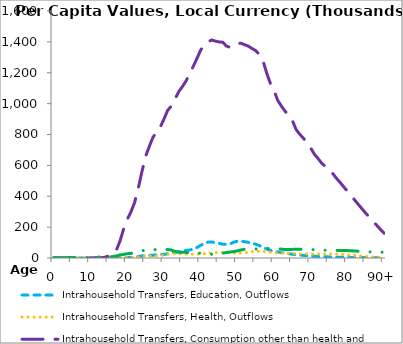
| Category | Intrahousehold Transfers, Education, Outflows | Intrahousehold Transfers, Health, Outflows | Intrahousehold Transfers, Consumption other than health and education, Outflows | Intrahousehold Transfers, Saving, Outflows |
|---|---|---|---|---|
| 0 | 0 | 0 | 13.707 | 1783.358 |
|  | 0 | 0 | 17.182 | 2243.664 |
| 2 | 0 | 0 | 13.179 | 1721.308 |
| 3 | 0.654 | 0 | 205.832 | 692.007 |
| 4 | 1.69 | 1.785 | 955.739 | 773.496 |
| 5 | 2.121 | 4.487 | 1674.86 | 2224.94 |
| 6 | 3.952 | 5.185 | 1877.273 | 3678.581 |
| 7 | 5.932 | 4.611 | 1683.966 | 4363.57 |
| 8 | 6.515 | 1.605 | 909.404 | 4203.334 |
| 9 | 7.216 | 3.31 | 617.222 | 3196.895 |
| 10 | 8.465 | 13.15 | 607.059 | 3528.599 |
| 11 | 12.484 | 26.097 | 797.229 | 4972.968 |
| 12 | 16.513 | 29.863 | 1231.877 | 7417.302 |
| 13 | 15.781 | 18.721 | 1847.221 | 7251.736 |
| 14 | 18.199 | 19.478 | 5093.768 | 5128.793 |
| 15 | 54.194 | 107.028 | 14907.415 | 6028.225 |
| 16 | 104.357 | 367.074 | 26502.081 | 8933.692 |
| 17 | 280.996 | 698.479 | 49227.429 | 13009.551 |
| 18 | 497.814 | 1469.888 | 108487.827 | 19297.418 |
| 19 | 945.268 | 2265.053 | 186185.487 | 23284.167 |
| 20 | 1926.455 | 2944.24 | 249116.11 | 27752.077 |
| 21 | 3734.16 | 3605.398 | 298258.717 | 29795.702 |
| 22 | 6635.319 | 5137.172 | 358544.565 | 36053.593 |
| 23 | 10361.619 | 7685.742 | 451713.299 | 42611.892 |
| 24 | 13195.509 | 10681.367 | 559153.868 | 46873.801 |
| 25 | 16076.113 | 13174.806 | 657746.625 | 51442.062 |
| 26 | 16872.816 | 13306.425 | 722515.627 | 50741.387 |
| 27 | 17973.904 | 13061.286 | 781390.99 | 50209.87 |
| 28 | 21116.834 | 13243.843 | 816418.22 | 56999.038 |
| 29 | 22050.311 | 15247.572 | 848299.57 | 58268.922 |
| 30 | 23417.652 | 19770.29 | 899786.01 | 55025.84 |
| 31 | 27276.328 | 23838.103 | 955683.53 | 54931.849 |
| 32 | 31847.605 | 26743.497 | 984480.37 | 51820.595 |
| 33 | 36155.291 | 29030.312 | 1028780.56 | 42890.42 |
| 34 | 40764.027 | 28572.796 | 1076789.65 | 37760.347 |
| 35 | 44831.846 | 26243.493 | 1109194.96 | 37761.679 |
| 36 | 48908.671 | 25120.842 | 1145803.18 | 36109.074 |
| 37 | 51708.419 | 24692.826 | 1195026.61 | 33805.966 |
| 38 | 57630.895 | 24752.387 | 1241829.25 | 33550.216 |
| 39 | 68425.327 | 25915.364 | 1293001.29 | 32477.774 |
| 40 | 81864.16 | 26449.929 | 1346209.34 | 30850.451 |
| 41 | 94568.311 | 28084.58 | 1380709.92 | 27800.258 |
| 42 | 102624.94 | 30802.27 | 1400173.3 | 25823.351 |
| 43 | 103992.23 | 32630.329 | 1412166.43 | 24412.821 |
| 44 | 99331.984 | 35333.549 | 1405087.55 | 24008.053 |
| 45 | 94644.271 | 36910.403 | 1399609.15 | 25922.347 |
| 46 | 89880.228 | 36940.506 | 1397867.45 | 30416.764 |
| 47 | 87683.124 | 34348.504 | 1373287.96 | 35775.884 |
| 48 | 91058.644 | 32065.69 | 1364435.86 | 38775.876 |
| 49 | 102183.62 | 32549.186 | 1375762.52 | 41830.78 |
| 50 | 108331.96 | 32233.023 | 1389211.62 | 45746.21 |
| 51 | 108611.23 | 31489.508 | 1391176.42 | 52224.114 |
| 52 | 105696.69 | 33789.66 | 1381309.34 | 56395.62 |
| 53 | 101606.64 | 38232.512 | 1372273.08 | 56871.979 |
| 54 | 95790.406 | 41197.075 | 1357068.21 | 56983.462 |
| 55 | 89179.476 | 42868.497 | 1343542.19 | 58196.798 |
| 56 | 80097.035 | 43392.637 | 1317157.94 | 60154.691 |
| 57 | 71114.057 | 42862.504 | 1276417.26 | 61991.958 |
| 58 | 57762.551 | 39981.271 | 1197751.65 | 61834.231 |
| 59 | 48878.48 | 37103.901 | 1130460.31 | 62409.871 |
| 60 | 44537.52 | 35297.255 | 1084418.85 | 61368.575 |
| 61 | 39649.177 | 33475.744 | 1021316.54 | 59734.595 |
| 62 | 35084.417 | 32132.246 | 983916.95 | 57543.08 |
| 63 | 31060.829 | 31329.149 | 951242.29 | 54650.552 |
| 64 | 27510.812 | 30657.167 | 921301.06 | 54783.2 |
| 65 | 24076.976 | 30383.163 | 889922.4 | 56105.58 |
| 66 | 22169.011 | 27496.351 | 832992.49 | 57318.629 |
| 67 | 20338.326 | 26644.629 | 801370.52 | 56535.856 |
| 68 | 17055.95 | 26438.758 | 776291.72 | 56381.041 |
| 69 | 15278.736 | 25978.967 | 744615.26 | 55479.782 |
| 70 | 12981.96 | 25441.655 | 711608.92 | 54433.177 |
| 71 | 11210.572 | 25237.274 | 671801.12 | 53931.893 |
| 72 | 10017.535 | 25398.254 | 644163.64 | 52665.059 |
| 73 | 8639.675 | 25362.204 | 613118.28 | 50823.636 |
| 74 | 7961.107 | 25806.449 | 593063.47 | 50732.23 |
| 75 | 7140.864 | 26119.798 | 571708.17 | 50300.909 |
| 76 | 6258.226 | 26168.111 | 546769.29 | 49796.727 |
| 77 | 5354.639 | 25566.215 | 516330.95 | 49250.055 |
| 78 | 4816.58 | 23827.956 | 489481.68 | 49404.715 |
| 79 | 4305.138 | 22083.794 | 460524.26 | 48834.962 |
| 80 | 3954.938 | 20203.884 | 432410.89 | 48046.171 |
| 81 | 3641.785 | 18304.28 | 403673.662 | 46871.656 |
| 82 | 3325.605 | 16342.877 | 374558.927 | 45404.784 |
| 83 | 3054.807 | 14338.455 | 346020.356 | 43859.366 |
| 84 | 2779.999 | 12373.415 | 317695.643 | 42411.778 |
| 85 | 2503.008 | 10405.076 | 289621.965 | 41054.143 |
| 86 | 2323.086 | 8351.37 | 263427.851 | 39842.1 |
| 87 | 2131.525 | 6340.824 | 237516.886 | 38869.336 |
| 88 | 1882.723 | 4395.764 | 211016.018 | 38039.072 |
| 89 | 1633.762 | 2468.084 | 184723.629 | 37323.922 |
| 90+ | 1469.16 | 621.557 | 160807.902 | 37253.265 |